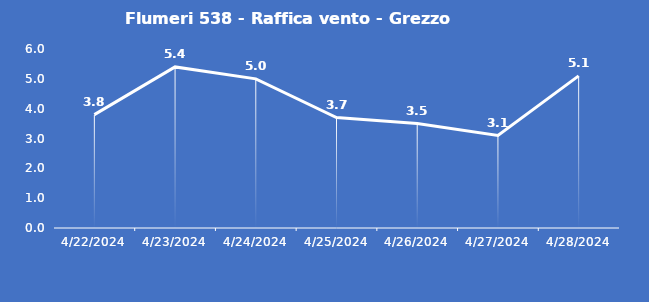
| Category | Flumeri 538 - Raffica vento - Grezzo (m/s) |
|---|---|
| 4/22/24 | 3.8 |
| 4/23/24 | 5.4 |
| 4/24/24 | 5 |
| 4/25/24 | 3.7 |
| 4/26/24 | 3.5 |
| 4/27/24 | 3.1 |
| 4/28/24 | 5.1 |